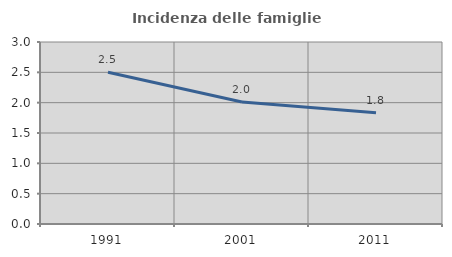
| Category | Incidenza delle famiglie numerose |
|---|---|
| 1991.0 | 2.5 |
| 2001.0 | 2.01 |
| 2011.0 | 1.835 |